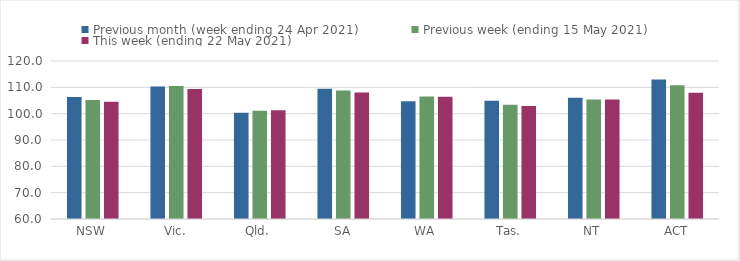
| Category | Previous month (week ending 24 Apr 2021) | Previous week (ending 15 May 2021) | This week (ending 22 May 2021) |
|---|---|---|---|
| NSW | 106.36 | 105.18 | 104.49 |
| Vic. | 110.28 | 110.51 | 109.39 |
| Qld. | 100.35 | 101.1 | 101.27 |
| SA | 109.48 | 108.82 | 108.04 |
| WA | 104.67 | 106.5 | 106.38 |
| Tas. | 104.93 | 103.37 | 102.94 |
| NT | 106.09 | 105.41 | 105.41 |
| ACT | 112.93 | 110.81 | 107.92 |